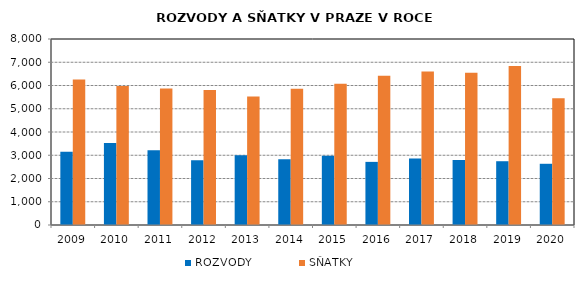
| Category | ROZVODY | SŇATKY |
|---|---|---|
| 2009.0 | 3150 | 6258 |
| 2010.0 | 3524 | 5978 |
| 2011.0 | 3220 | 5873 |
| 2012.0 | 2788 | 5807 |
| 2013.0 | 3002 | 5531 |
| 2014.0 | 2828 | 5862 |
| 2015.0 | 2983 | 6073 |
| 2016.0 | 2715 | 6415 |
| 2017.0 | 2860 | 6604 |
| 2018.0 | 2798 | 6549 |
| 2019.0 | 2743 | 6841 |
| 2020.0 | 2633 | 5455 |